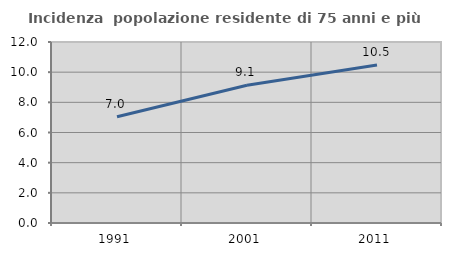
| Category | Incidenza  popolazione residente di 75 anni e più |
|---|---|
| 1991.0 | 7.047 |
| 2001.0 | 9.133 |
| 2011.0 | 10.481 |